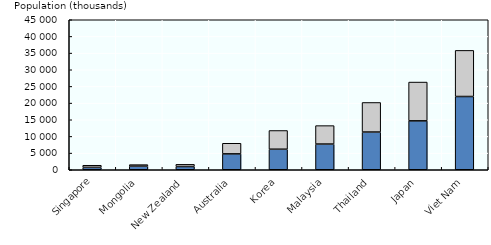
| Category | 0-14 year olds | 15-24 year olds |
|---|---|---|
| Singapore | 712.519 | 641.325 |
| Mongolia | 1085.726 | 453.478 |
| New Zealand | 969.038 | 660.828 |
| Australia | 4762.567 | 3184.388 |
| Korea | 6163.824 | 5613.79 |
| Malaysia | 7709.094 | 5533.284 |
| Thailand | 11313.244 | 8875.066 |
| Japan | 14671.838 | 11637.935 |
| Viet Nam | 21974.314 | 13836.742 |